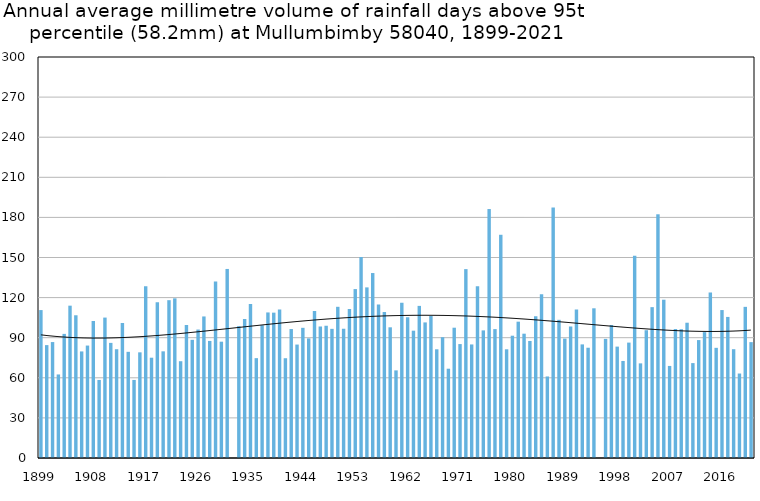
| Category | Annual average mm in days above 95th percentile |
|---|---|
| 1899 | 110.667 |
| 1900 | 84.457 |
| 1901 | 86.733 |
| 1902 | 62.5 |
| 1903 | 92.856 |
| 1904 | 113.962 |
| 1905 | 106.783 |
| 1906 | 79.733 |
| 1907 | 84.117 |
| 1908 | 102.433 |
| 1909 | 58.4 |
| 1910 | 105.05 |
| 1911 | 86.125 |
| 1912 | 81.375 |
| 1913 | 101.014 |
| 1914 | 79.433 |
| 1915 | 58.4 |
| 1916 | 79.05 |
| 1917 | 128.5 |
| 1918 | 75.033 |
| 1919 | 116.45 |
| 1920 | 79.8 |
| 1921 | 118.067 |
| 1922 | 119.45 |
| 1923 | 72.4 |
| 1924 | 99.517 |
| 1925 | 88.42 |
| 1926 | 96.1 |
| 1927 | 105.9 |
| 1928 | 87.575 |
| 1929 | 132.13 |
| 1930 | 87.02 |
| 1931 | 141.438 |
| 1932 | 0 |
| 1933 | 98.65 |
| 1934 | 103.95 |
| 1935 | 115.3 |
| 1936 | 74.7 |
| 1937 | 99.33 |
| 1938 | 108.9 |
| 1939 | 108.74 |
| 1940 | 111.075 |
| 1941 | 74.64 |
| 1942 | 96.478 |
| 1943 | 84.875 |
| 1944 | 97.4 |
| 1945 | 89.486 |
| 1946 | 110.02 |
| 1947 | 98.357 |
| 1948 | 98.95 |
| 1949 | 96.62 |
| 1950 | 113.114 |
| 1951 | 96.775 |
| 1952 | 111.525 |
| 1953 | 126.367 |
| 1954 | 150.371 |
| 1955 | 127.644 |
| 1956 | 138.378 |
| 1957 | 114.9 |
| 1958 | 109.2 |
| 1959 | 97.778 |
| 1960 | 65.55 |
| 1961 | 116.15 |
| 1962 | 105.275 |
| 1963 | 95.255 |
| 1964 | 113.8 |
| 1965 | 101.433 |
| 1966 | 106.225 |
| 1967 | 81.325 |
| 1968 | 90.375 |
| 1969 | 66.8 |
| 1970 | 97.48 |
| 1971 | 85.233 |
| 1972 | 141.3 |
| 1973 | 84.956 |
| 1974 | 128.467 |
| 1975 | 95.475 |
| 1976 | 186.25 |
| 1977 | 96.433 |
| 1978 | 167 |
| 1979 | 81.333 |
| 1980 | 91.5 |
| 1981 | 102 |
| 1982 | 93 |
| 1983 | 87.556 |
| 1984 | 106 |
| 1985 | 122.5 |
| 1986 | 61 |
| 1987 | 187.4 |
| 1988 | 103.385 |
| 1989 | 89.333 |
| 1990 | 98.375 |
| 1991 | 111.167 |
| 1992 | 85 |
| 1993 | 82.5 |
| 1994 | 112 |
| 1995 | 0 |
| 1996 | 89.111 |
| 1997 | 99.5 |
| 1998 | 83.333 |
| 1999 | 72.6 |
| 2000 | 86.333 |
| 2001 | 151.24 |
| 2002 | 70.8 |
| 2003 | 95.6 |
| 2004 | 112.857 |
| 2005 | 182.333 |
| 2006 | 118.429 |
| 2007 | 68.88 |
| 2008 | 96.556 |
| 2009 | 96.345 |
| 2010 | 101.2 |
| 2011 | 71 |
| 2012 | 88.222 |
| 2013 | 94.182 |
| 2014 | 123.733 |
| 2015 | 82.422 |
| 2016 | 110.675 |
| 2017 | 105.545 |
| 2018 | 81.4 |
| 2019 | 63.2 |
| 2020 | 113.08 |
| 2021 | 86.689 |